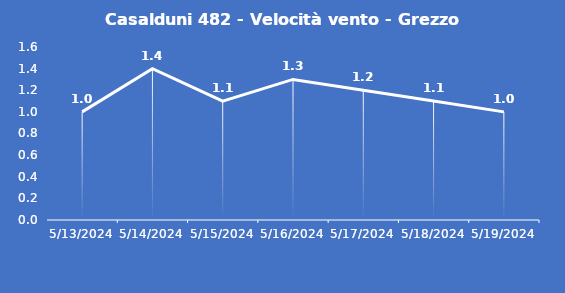
| Category | Casalduni 482 - Velocità vento - Grezzo (m/s) |
|---|---|
| 5/13/24 | 1 |
| 5/14/24 | 1.4 |
| 5/15/24 | 1.1 |
| 5/16/24 | 1.3 |
| 5/17/24 | 1.2 |
| 5/18/24 | 1.1 |
| 5/19/24 | 1 |